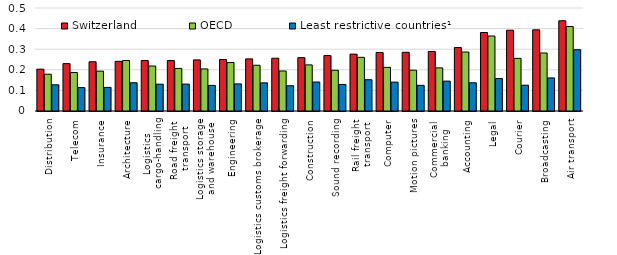
| Category | Switzerland | OECD  | Least restrictive countries¹ |
|---|---|---|---|
| Distribution | 0.203 | 0.179 | 0.127 |
| Telecom | 0.23 | 0.187 | 0.114 |
| Insurance | 0.239 | 0.193 | 0.115 |
| Architecture | 0.241 | 0.245 | 0.137 |
| Logistics 
cargo-handling | 0.245 | 0.218 | 0.13 |
| Road freight
 transport | 0.245 | 0.207 | 0.131 |
| Logistics storage
 and warehouse | 0.248 | 0.204 | 0.124 |
| Engineering | 0.25 | 0.235 | 0.132 |
| Logistics customs brokerage | 0.253 | 0.222 | 0.137 |
| Logistics freight forwarding | 0.256 | 0.194 | 0.123 |
| Construction | 0.259 | 0.224 | 0.141 |
| Sound recording | 0.269 | 0.198 | 0.129 |
| Rail freight
 transport | 0.276 | 0.261 | 0.152 |
| Computer | 0.284 | 0.212 | 0.14 |
| Motion pictures | 0.285 | 0.198 | 0.125 |
| Commercial
 banking | 0.289 | 0.209 | 0.145 |
| Accounting | 0.308 | 0.286 | 0.137 |
| Legal | 0.381 | 0.364 | 0.158 |
| Courier | 0.392 | 0.255 | 0.125 |
| Broadcasting | 0.394 | 0.282 | 0.161 |
| Air transport | 0.438 | 0.41 | 0.297 |